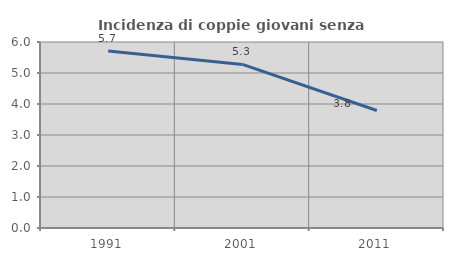
| Category | Incidenza di coppie giovani senza figli |
|---|---|
| 1991.0 | 5.71 |
| 2001.0 | 5.277 |
| 2011.0 | 3.79 |